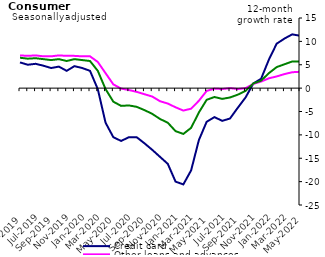
| Category | Credit card | Other loans and advances | Total |
|---|---|---|---|
| May-2019 | 5.5 | 7 | 6.5 |
| Jun-2019 | 5 | 6.9 | 6.3 |
| Jul-2019 | 5.2 | 7 | 6.4 |
| Aug-2019 | 4.8 | 6.8 | 6.2 |
| Sep-2019 | 4.3 | 6.8 | 6 |
| Oct-2019 | 4.6 | 7 | 6.2 |
| Nov-2019 | 3.7 | 6.9 | 5.8 |
| Dec-2019 | 4.7 | 6.9 | 6.2 |
| Jan-2020 | 4.3 | 6.8 | 6 |
| Feb-2020 | 3.7 | 6.8 | 5.8 |
| Mar-2020 | -0.2 | 5.6 | 3.7 |
| Apr-2020 | -7.4 | 3.2 | -0.2 |
| May-2020 | -10.5 | 0.8 | -2.9 |
| Jun-2020 | -11.3 | -0.1 | -3.8 |
| Jul-2020 | -10.5 | -0.4 | -3.7 |
| Aug-2020 | -10.5 | -0.8 | -4 |
| Sep-2020 | -11.8 | -1.3 | -4.7 |
| Oct-2020 | -13.2 | -1.8 | -5.5 |
| Nov-2020 | -14.7 | -2.8 | -6.6 |
| Dec-2020 | -16.2 | -3.3 | -7.4 |
| Jan-2021 | -20 | -4.1 | -9.2 |
| Feb-2021 | -20.6 | -4.8 | -9.8 |
| Mar-2021 | -17.6 | -4.4 | -8.5 |
| Apr-2021 | -11.1 | -2.7 | -5.2 |
| May-2021 | -7.2 | -0.6 | -2.5 |
| Jun-2021 | -6.2 | -0.1 | -1.9 |
| Jul-2021 | -7 | -0.2 | -2.3 |
| Aug-2021 | -6.5 | 0 | -2 |
| Sep-2021 | -4.2 | -0.2 | -1.4 |
| Oct-2021 | -2 | 0 | -0.6 |
| Nov-2021 | 1 | 0.9 | 1 |
| Dec-2021 | 2 | 1.4 | 1.6 |
| Jan-2022 | 6.1 | 2.1 | 3.2 |
| Feb-2022 | 9.5 | 2.5 | 4.5 |
| Mar-2022 | 10.6 | 3 | 5.1 |
| Apr-2022 | 11.5 | 3.4 | 5.7 |
| May-2022 | 11.2 | 3.5 | 5.7 |